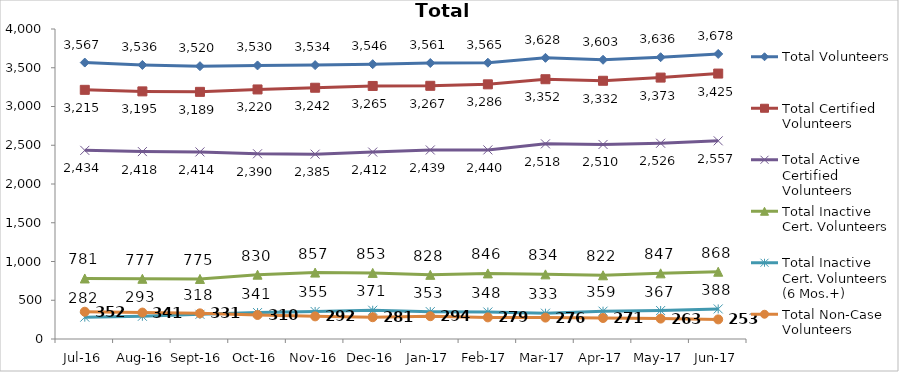
| Category | Total Volunteers | Total Certified Volunteers | Total Active Certified Volunteers | Total Inactive Cert. Volunteers | Total Inactive Cert. Volunteers (6 Mos.+) | Total Non-Case Volunteers |
|---|---|---|---|---|---|---|
| Jul-16 | 3567 | 3215 | 2434 | 781 | 282 | 352 |
| Aug-16 | 3536 | 3195 | 2418 | 777 | 293 | 341 |
| Sep-16 | 3520 | 3189 | 2414 | 775 | 318 | 331 |
| Oct-16 | 3530 | 3220 | 2390 | 830 | 341 | 310 |
| Nov-16 | 3534 | 3242 | 2385 | 857 | 355 | 292 |
| Dec-16 | 3546 | 3265 | 2412 | 853 | 371 | 281 |
| Jan-17 | 3561 | 3267 | 2439 | 828 | 353 | 294 |
| Feb-17 | 3565 | 3286 | 2440 | 846 | 348 | 279 |
| Mar-17 | 3628 | 3352 | 2518 | 834 | 333 | 276 |
| Apr-17 | 3603 | 3332 | 2510 | 822 | 359 | 271 |
| May-17 | 3636 | 3373 | 2526 | 847 | 367 | 263 |
| Jun-17 | 3678 | 3425 | 2557 | 868 | 388 | 253 |